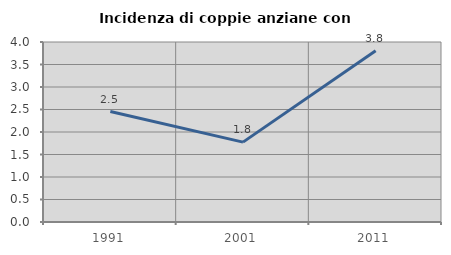
| Category | Incidenza di coppie anziane con figli |
|---|---|
| 1991.0 | 2.454 |
| 2001.0 | 1.775 |
| 2011.0 | 3.804 |